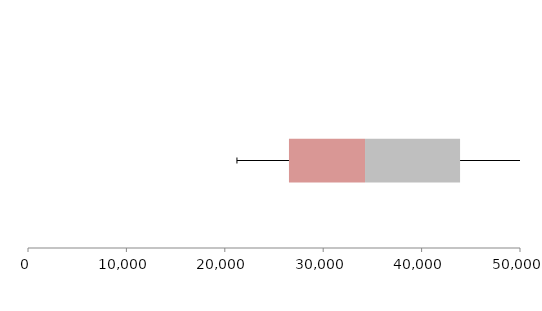
| Category | Series 1 | Series 2 | Series 3 |
|---|---|---|---|
| 0 | 26521.556 | 7729.189 | 9658.222 |